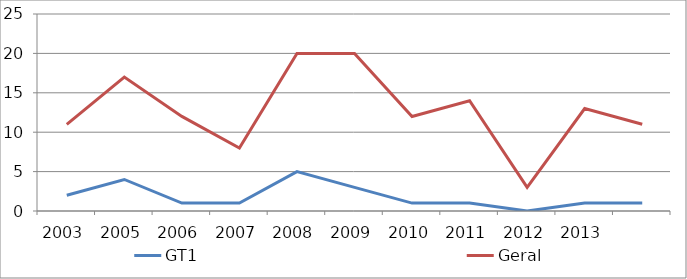
| Category | GT1 | Geral |
|---|---|---|
| 2003.0 | 2 | 11 |
| 2005.0 | 4 | 17 |
| 2006.0 | 1 | 12 |
| 2007.0 | 1 | 8 |
| 2008.0 | 5 | 20 |
| 2009.0 | 3 | 20 |
| 2010.0 | 1 | 12 |
| 2011.0 | 1 | 14 |
| 2012.0 | 0 | 3 |
| 2013.0 | 1 | 13 |